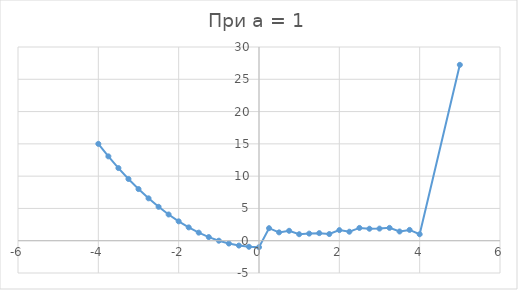
| Category | y |
|---|---|
| -4.0 | 15 |
| -3.75 | 13.062 |
| -3.5 | 11.25 |
| -3.25 | 9.562 |
| -3.0 | 8 |
| -2.75 | 6.562 |
| -2.5 | 5.25 |
| -2.25 | 4.062 |
| -2.0 | 3 |
| -1.75 | 2.062 |
| -1.5 | 1.25 |
| -1.25 | 0.562 |
| -1.0 | 0 |
| -0.75 | -0.438 |
| -0.5 | -0.75 |
| -0.25 | -0.938 |
| 0.0 | -1 |
| 0.25 | 1.939 |
| 0.5 | 1.292 |
| 0.75 | 1.535 |
| 1.0 | 1.005 |
| 1.25 | 1.099 |
| 1.5 | 1.173 |
| 1.75 | 1.032 |
| 2.0 | 1.642 |
| 2.25 | 1.395 |
| 2.5 | 1.98 |
| 2.75 | 1.854 |
| 3.0 | 1.877 |
| 3.25 | 1.988 |
| 3.5 | 1.427 |
| 3.75 | 1.673 |
| 4.0 | 1 |
| 5.0 | 27.236 |